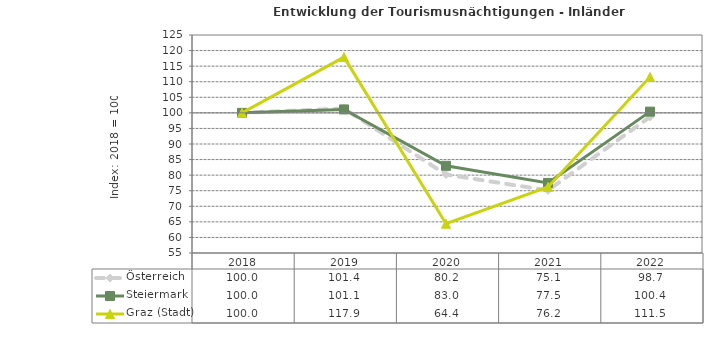
| Category | Österreich | Steiermark | Graz (Stadt) |
|---|---|---|---|
| 2022.0 | 98.7 | 100.4 | 111.5 |
| 2021.0 | 75.1 | 77.5 | 76.2 |
| 2020.0 | 80.2 | 83 | 64.4 |
| 2019.0 | 101.4 | 101.1 | 117.9 |
| 2018.0 | 100 | 100 | 100 |